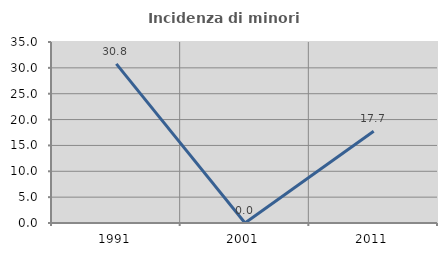
| Category | Incidenza di minori stranieri |
|---|---|
| 1991.0 | 30.769 |
| 2001.0 | 0 |
| 2011.0 | 17.742 |